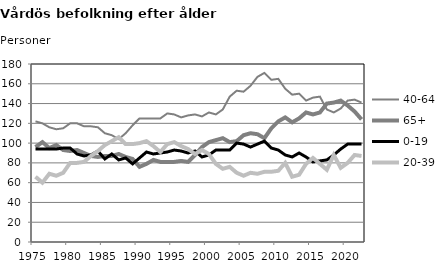
| Category | 40-64 | 65+ | 0-19 | 20-39 |
|---|---|---|---|---|
| 1975.0 | 122 | 96 | 94 | 66 |
| 1976.0 | 120 | 101 | 94 | 60 |
| 1977.0 | 116 | 95 | 94 | 69 |
| 1978.0 | 114 | 98 | 94 | 67 |
| 1979.0 | 115 | 93 | 95 | 70 |
| 1980.0 | 120 | 92 | 95 | 80 |
| 1981.0 | 120 | 93 | 89 | 80 |
| 1982.0 | 117 | 90 | 87 | 81 |
| 1983.0 | 117 | 87 | 88 | 87 |
| 1984.0 | 116 | 86 | 92 | 92 |
| 1985.0 | 110 | 87 | 84 | 98 |
| 1986.0 | 108 | 87 | 89 | 102 |
| 1987.0 | 104 | 89 | 83 | 106 |
| 1988.0 | 110 | 86 | 85 | 99 |
| 1989.0 | 118 | 84 | 79 | 99 |
| 1990.0 | 125 | 76 | 85 | 100 |
| 1991.0 | 125 | 79 | 91 | 102 |
| 1992.0 | 125 | 83 | 89 | 97 |
| 1993.0 | 125 | 81 | 90 | 91 |
| 1994.0 | 130 | 81 | 91 | 99 |
| 1995.0 | 129 | 81 | 93 | 101 |
| 1996.0 | 126 | 82 | 92 | 97 |
| 1997.0 | 128 | 81 | 90 | 94 |
| 1998.0 | 129 | 88 | 92 | 89 |
| 1999.0 | 127 | 96 | 86 | 93 |
| 2000.0 | 131 | 101 | 88 | 89 |
| 2001.0 | 129 | 103 | 93 | 79 |
| 2002.0 | 134 | 105 | 93 | 74 |
| 2003.0 | 147 | 101 | 93 | 76 |
| 2004.0 | 153 | 102 | 100 | 70 |
| 2005.0 | 152 | 108 | 99 | 67 |
| 2006.0 | 158 | 110 | 96 | 70 |
| 2007.0 | 167 | 109 | 99 | 69 |
| 2008.0 | 171 | 105 | 102 | 71 |
| 2009.0 | 164 | 115 | 95 | 71 |
| 2010.0 | 165 | 122 | 93 | 72 |
| 2011.0 | 155 | 126 | 88 | 80 |
| 2012.0 | 149 | 121 | 86 | 66 |
| 2013.0 | 150 | 125 | 90 | 68 |
| 2014.0 | 143 | 131 | 86 | 79 |
| 2015.0 | 146 | 129 | 81 | 85 |
| 2016.0 | 147 | 131 | 82 | 79 |
| 2017.0 | 134 | 140 | 83 | 73 |
| 2018.0 | 131 | 141 | 88 | 88 |
| 2019.0 | 135 | 143 | 94 | 75 |
| 2020.0 | 143 | 138 | 99 | 80 |
| 2021.0 | 144 | 132 | 99 | 88 |
| 2022.0 | 141 | 124 | 99 | 87 |